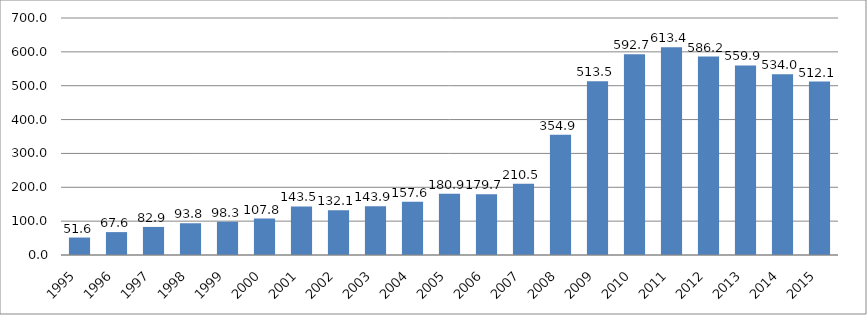
| Category | Disbursed Outstanding Debt |
|---|---|
| 1995.0 | 51.6 |
| 1996.0 | 67.6 |
| 1997.0 | 82.9 |
| 1998.0 | 93.8 |
| 1999.0 | 98.3 |
| 2000.0 | 107.8 |
| 2001.0 | 143.5 |
| 2002.0 | 132.1 |
| 2003.0 | 143.9 |
| 2004.0 | 157.6 |
| 2005.0 | 180.9 |
| 2006.0 | 179.7 |
| 2007.0 | 210.5 |
| 2008.0 | 354.9 |
| 2009.0 | 513.5 |
| 2010.0 | 592.7 |
| 2011.0 | 613.4 |
| 2012.0 | 586.2 |
| 2013.0 | 559.9 |
| 2014.0 | 534 |
| 2015.0 | 512.118 |